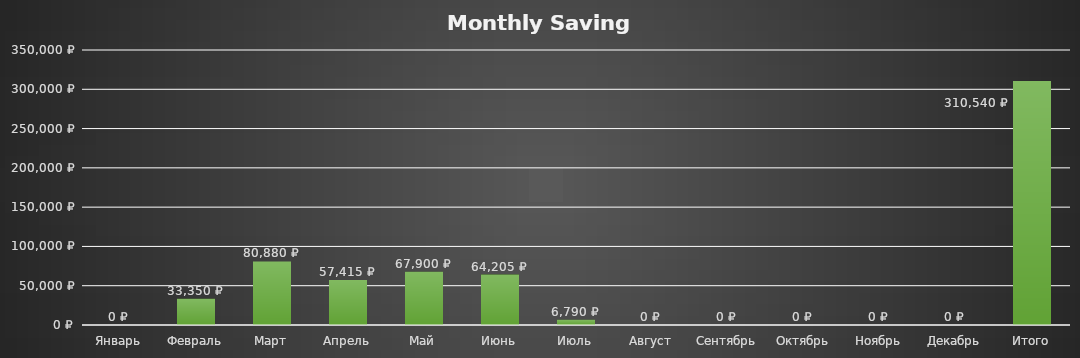
| Category | Final saving |
|---|---|
| Январь | 0 |
| Февраль | 33350 |
| Март | 80880 |
| Апрель | 57415 |
| Май | 67900 |
| Июнь | 64205 |
| Июль | 6790 |
| Август | 0 |
| Сентябрь | 0 |
| Октябрь | 0 |
| Ноябрь | 0 |
| Декабрь | 0 |
| Итого | 310540 |